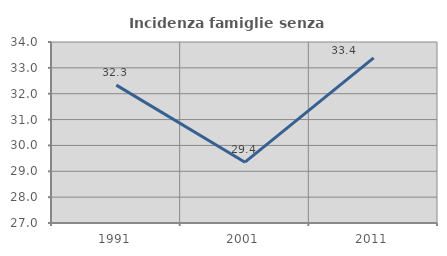
| Category | Incidenza famiglie senza nuclei |
|---|---|
| 1991.0 | 32.332 |
| 2001.0 | 29.352 |
| 2011.0 | 33.386 |